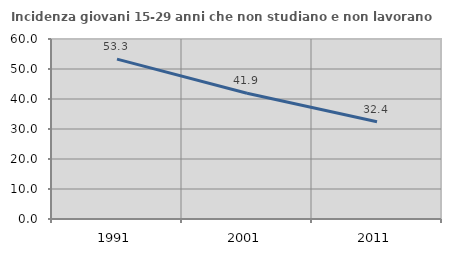
| Category | Incidenza giovani 15-29 anni che non studiano e non lavorano  |
|---|---|
| 1991.0 | 53.294 |
| 2001.0 | 41.905 |
| 2011.0 | 32.424 |